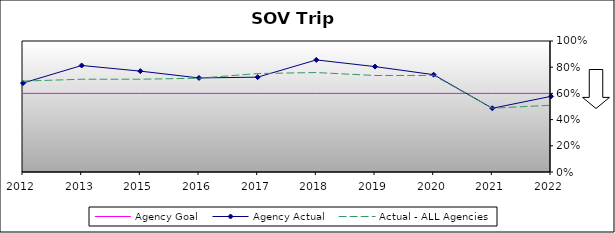
| Category | Agency Goal | Agency Actual | Actual - ALL Agencies |
|---|---|---|---|
| 2012.0 | 0.6 | 0.679 | 0.694 |
| 2013.0 | 0.6 | 0.813 | 0.708 |
| 2015.0 | 0.6 | 0.77 | 0.708 |
| 2016.0 | 0.6 | 0.718 | 0.716 |
| 2017.0 | 0.6 | 0.724 | 0.752 |
| 2018.0 | 0.6 | 0.856 | 0.759 |
| 2019.0 | 0.6 | 0.805 | 0.736 |
| 2020.0 | 0.6 | 0.743 | 0.737 |
| 2021.0 | 0.6 | 0.486 | 0.487 |
| 2022.0 | 0.6 | 0.578 | 0.509 |